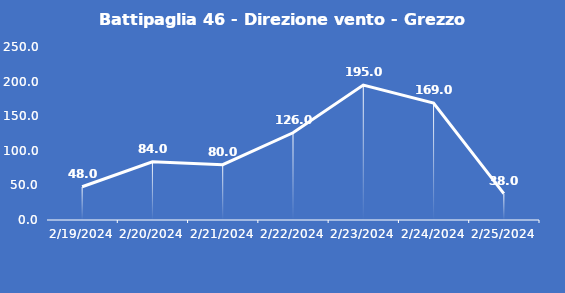
| Category | Battipaglia 46 - Direzione vento - Grezzo (°N) |
|---|---|
| 2/19/24 | 48 |
| 2/20/24 | 84 |
| 2/21/24 | 80 |
| 2/22/24 | 126 |
| 2/23/24 | 195 |
| 2/24/24 | 169 |
| 2/25/24 | 38 |